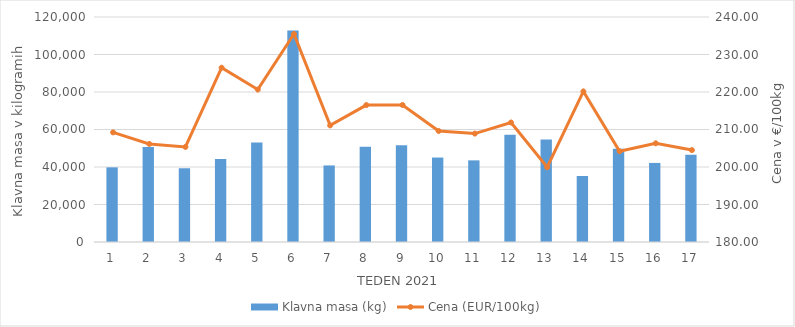
| Category | Klavna masa (kg) |
|---|---|
| 1.0 | 39814 |
| 2.0 | 50603 |
| 3.0 | 39295 |
| 4.0 | 44250 |
| 5.0 | 53061 |
| 6.0 | 112816 |
| 7.0 | 40829 |
| 8.0 | 50775 |
| 9.0 | 51535 |
| 10.0 | 45040 |
| 11.0 | 43536 |
| 12.0 | 57246 |
| 13.0 | 54680 |
| 14.0 | 35237 |
| 15.0 | 49721 |
| 16.0 | 42177 |
| 17.0 | 46525 |